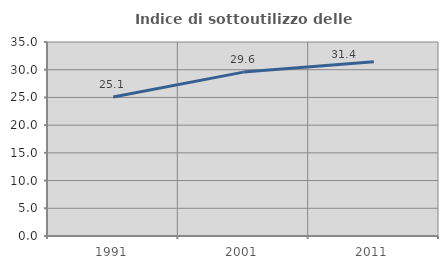
| Category | Indice di sottoutilizzo delle abitazioni  |
|---|---|
| 1991.0 | 25.072 |
| 2001.0 | 29.569 |
| 2011.0 | 31.431 |